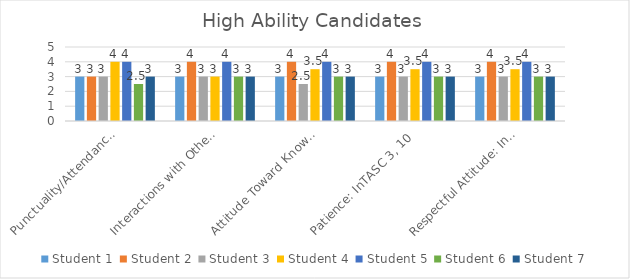
| Category | Student 1 | Student 2 | Student 3 | Student 4 | Student 5 | Student 6 | Student 7 |
|---|---|---|---|---|---|---|---|
| Punctuality/Attendance: InTASC 1, 9 | 3 | 3 | 3 | 4 | 4 | 2.5 | 3 |
| Interactions with Others: InTASC 3, 7, 10 | 3 | 4 | 3 | 3 | 4 | 3 | 3 |
| Attitude Toward Knowledge and Learning: InTASC 1, 4, 5, 9, 10 | 3 | 4 | 2.5 | 3.5 | 4 | 3 | 3 |
| Patience: InTASC 3, 10 | 3 | 4 | 3 | 3.5 | 4 | 3 | 3 |
| Respectful Attitude: InTASC 3, 7, 10 | 3 | 4 | 3 | 3.5 | 4 | 3 | 3 |